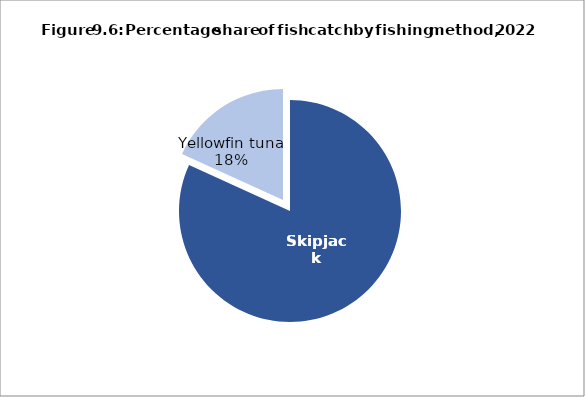
| Category | Series 0 |
|---|---|
| Skipjack | 81.431 |
| Yellowfin tuna | 18.094 |